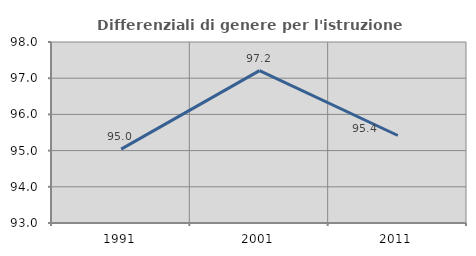
| Category | Differenziali di genere per l'istruzione superiore |
|---|---|
| 1991.0 | 95.04 |
| 2001.0 | 97.209 |
| 2011.0 | 95.417 |